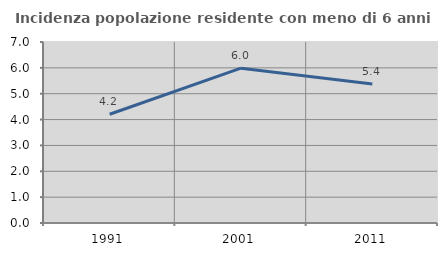
| Category | Incidenza popolazione residente con meno di 6 anni |
|---|---|
| 1991.0 | 4.206 |
| 2001.0 | 5.988 |
| 2011.0 | 5.373 |